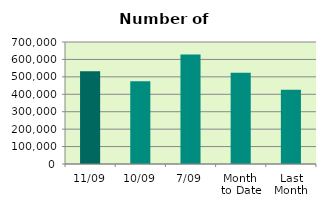
| Category | Series 0 |
|---|---|
| 11/09 | 532134 |
| 10/09 | 475166 |
| 7/09 | 627598 |
| Month 
to Date | 523194.857 |
| Last
Month | 425540 |